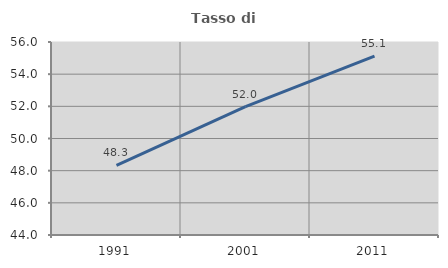
| Category | Tasso di occupazione   |
|---|---|
| 1991.0 | 48.329 |
| 2001.0 | 51.976 |
| 2011.0 | 55.118 |